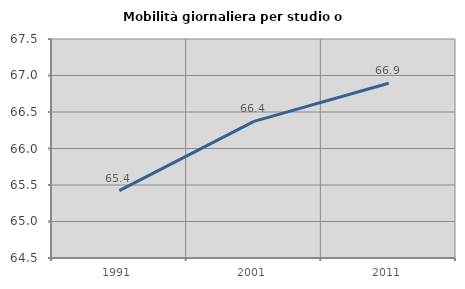
| Category | Mobilità giornaliera per studio o lavoro |
|---|---|
| 1991.0 | 65.422 |
| 2001.0 | 66.371 |
| 2011.0 | 66.893 |